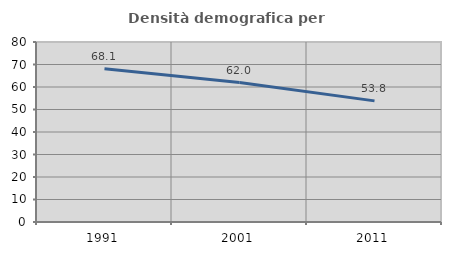
| Category | Densità demografica |
|---|---|
| 1991.0 | 68.081 |
| 2001.0 | 61.975 |
| 2011.0 | 53.828 |